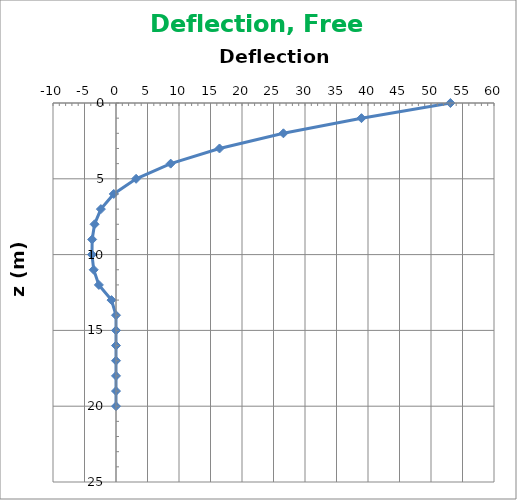
| Category | Series 0 |
|---|---|
| 53.08087711068038 | 0 |
| 38.96442225352949 | 1 |
| 26.576684163586492 | 2 |
| 16.430997675128506 | 3 |
| 8.678275246273845 | 4 |
| 3.1902988773842633 | 5 |
| -0.35698797053286696 | 6 |
| -2.400188457422339 | 7 |
| -3.405160445778916 | 8 |
| -3.783724582245067 | 9 |
| -3.810372379208832 | 10 |
| -3.5389742964015536 | 11 |
| -2.71948782249576 | 12 |
| -0.7146655567028575 | 13 |
| 0.0 | 14 |
| 0.0 | 15 |
| 0.0 | 16 |
| 0.0 | 17 |
| 0.0 | 18 |
| 0.0 | 19 |
| 0.0 | 20 |